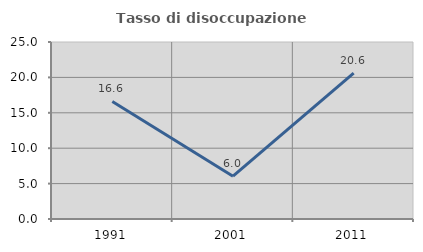
| Category | Tasso di disoccupazione giovanile  |
|---|---|
| 1991.0 | 16.6 |
| 2001.0 | 6.044 |
| 2011.0 | 20.609 |